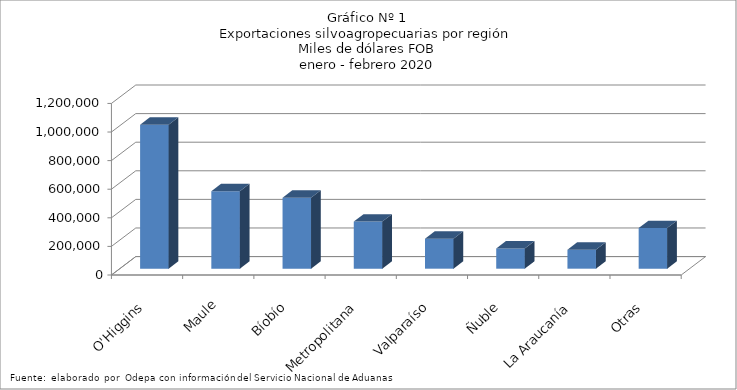
| Category | Series 0 |
|---|---|
| O'Higgins | 1006824.583 |
| Maule | 542082.424 |
| Bíobío | 496987.135 |
| Metropolitana | 329750.147 |
| Valparaíso | 209705.773 |
| Ñuble | 141291.306 |
| La Araucanía | 132546.366 |
| Otras | 284487.428 |